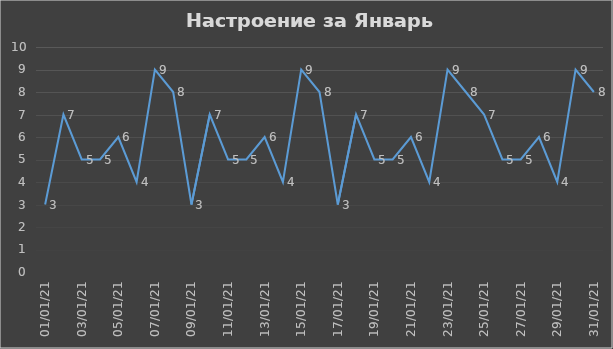
| Category | Series 0 |
|---|---|
| 2021-01-01 | 3 |
| 2021-01-02 | 7 |
| 2021-01-03 | 5 |
| 2021-01-04 | 5 |
| 2021-01-05 | 6 |
| 2021-01-06 | 4 |
| 2021-01-07 | 9 |
| 2021-01-08 | 8 |
| 2021-01-09 | 3 |
| 2021-01-10 | 7 |
| 2021-01-11 | 5 |
| 2021-01-12 | 5 |
| 2021-01-13 | 6 |
| 2021-01-14 | 4 |
| 2021-01-15 | 9 |
| 2021-01-16 | 8 |
| 2021-01-17 | 3 |
| 2021-01-18 | 7 |
| 2021-01-19 | 5 |
| 2021-01-20 | 5 |
| 2021-01-21 | 6 |
| 2021-01-22 | 4 |
| 2021-01-23 | 9 |
| 2021-01-24 | 8 |
| 2021-01-25 | 7 |
| 2021-01-26 | 5 |
| 2021-01-27 | 5 |
| 2021-01-28 | 6 |
| 2021-01-29 | 4 |
| 2021-01-30 | 9 |
| 2021-01-31 | 8 |